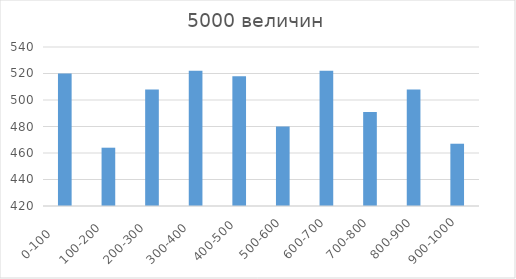
| Category | Series 0 |
|---|---|
| 0-100     | 520 |
| 100-200   | 464 |
| 200-300   | 508 |
| 300-400   | 522 |
| 400-500  | 518 |
| 500-600 | 480 |
| 600-700 | 522 |
| 700-800 | 491 |
| 800-900 | 508 |
| 900-1000 | 467 |